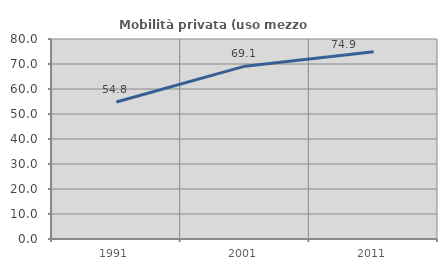
| Category | Mobilità privata (uso mezzo privato) |
|---|---|
| 1991.0 | 54.819 |
| 2001.0 | 69.144 |
| 2011.0 | 74.901 |